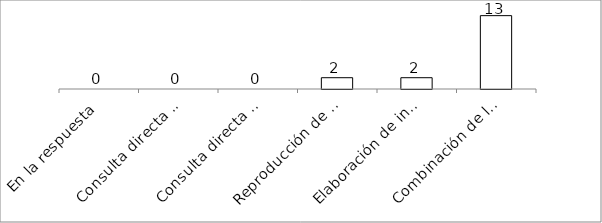
| Category | Series 0 |
|---|---|
| En la respuesta | 0 |
| Consulta directa personal | 0 |
| Consulta directa electrónica | 0 |
| Reproducción de documentos | 2 |
| Elaboración de informes | 2 |
| Combinación de las anteriores | 13 |